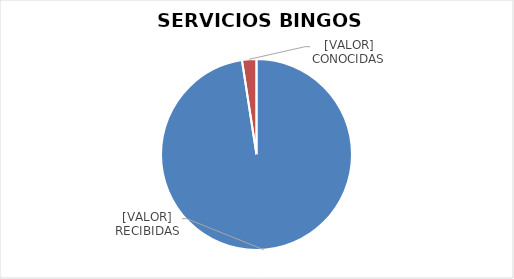
| Category | Series 0 |
|---|---|
| 0 | 40 |
| 1 | 1 |